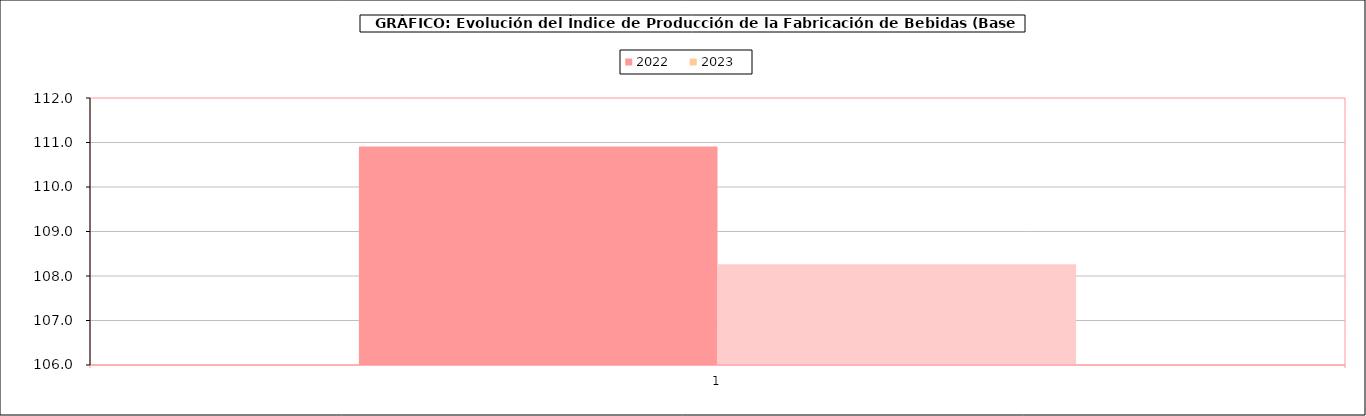
| Category | 2022 | 2023 |
|---|---|---|
| 0 | 110.912 | 108.265 |